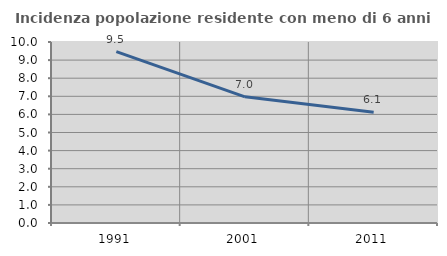
| Category | Incidenza popolazione residente con meno di 6 anni |
|---|---|
| 1991.0 | 9.466 |
| 2001.0 | 6.969 |
| 2011.0 | 6.115 |